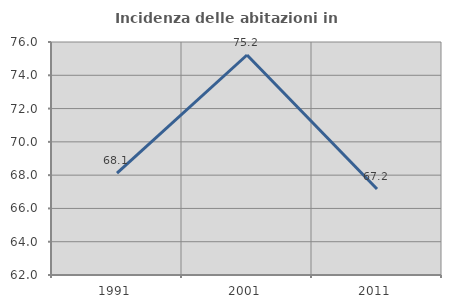
| Category | Incidenza delle abitazioni in proprietà  |
|---|---|
| 1991.0 | 68.12 |
| 2001.0 | 75.219 |
| 2011.0 | 67.168 |